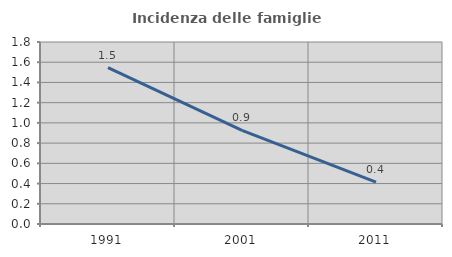
| Category | Incidenza delle famiglie numerose |
|---|---|
| 1991.0 | 1.546 |
| 2001.0 | 0.926 |
| 2011.0 | 0.413 |